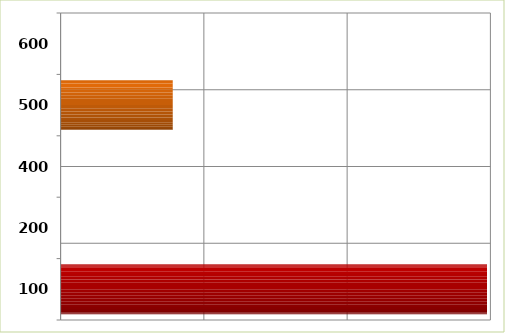
| Category | Series 0 |
|---|---|
| 100.0 | 297630565.98 |
| 200.0 | 0 |
| 400.0 | 0 |
| 500.0 | 78276990 |
| 600.0 | 0 |